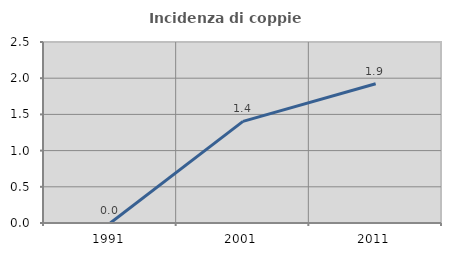
| Category | Incidenza di coppie miste |
|---|---|
| 1991.0 | 0 |
| 2001.0 | 1.404 |
| 2011.0 | 1.923 |